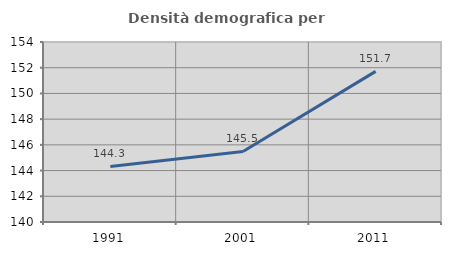
| Category | Densità demografica |
|---|---|
| 1991.0 | 144.317 |
| 2001.0 | 145.49 |
| 2011.0 | 151.716 |